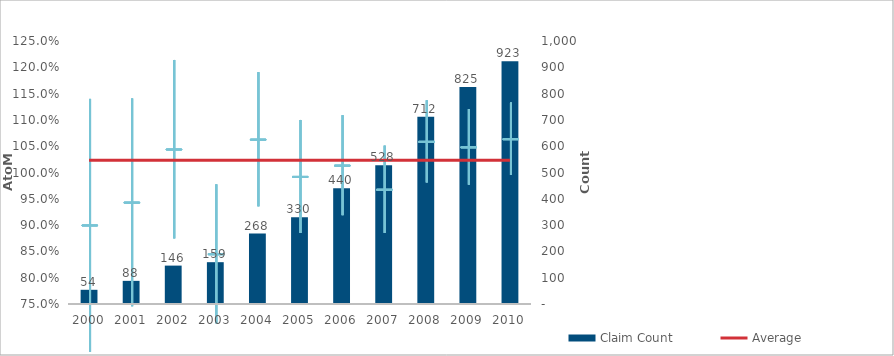
| Category | Claim Count |
|---|---|
| 0 | 54 |
| 1 | 88 |
| 2 | 146 |
| 3 | 159 |
| 4 | 268 |
| 5 | 330 |
| 6 | 440 |
| 7 | 528 |
| 8 | 712 |
| 9 | 825 |
| 10 | 923 |